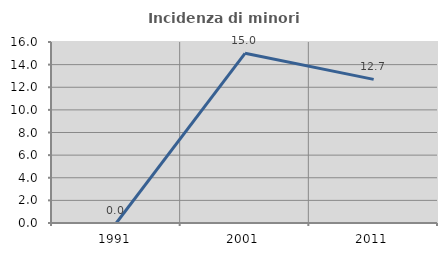
| Category | Incidenza di minori stranieri |
|---|---|
| 1991.0 | 0 |
| 2001.0 | 15 |
| 2011.0 | 12.698 |